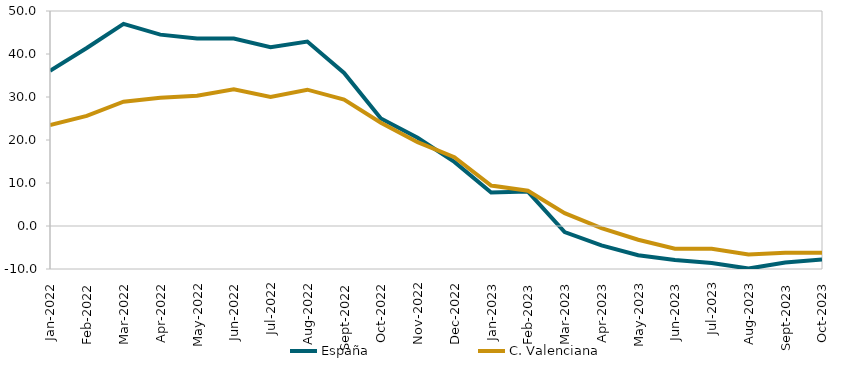
| Category | España | C. Valenciana |
|---|---|---|
| 2022-01-01 | 36.1 | 23.5 |
| 2022-02-01 | 41.4 | 25.6 |
| 2022-03-01 | 47 | 28.9 |
| 2022-04-01 | 44.5 | 29.8 |
| 2022-05-01 | 43.6 | 30.3 |
| 2022-06-01 | 43.6 | 31.8 |
| 2022-07-01 | 41.6 | 30 |
| 2022-08-01 | 42.9 | 31.7 |
| 2022-09-01 | 35.6 | 29.4 |
| 2022-10-01 | 25 | 24 |
| 2022-11-01 | 20.5 | 19.5 |
| 2022-12-01 | 14.9 | 16 |
| 2023-01-01 | 7.8 | 9.4 |
| 2023-02-01 | 8 | 8.2 |
| 2023-03-01 | -1.4 | 3 |
| 2023-04-01 | -4.5 | -0.5 |
| 2023-05-01 | -6.8 | -3.2 |
| 2023-06-01 | -7.9 | -5.3 |
| 2023-07-01 | -8.6 | -5.3 |
| 2023-08-01 | -9.9 | -6.6 |
| 2023-09-01 | -8.5 | -6.2 |
| 2023-10-01 | -7.8 | -6.2 |